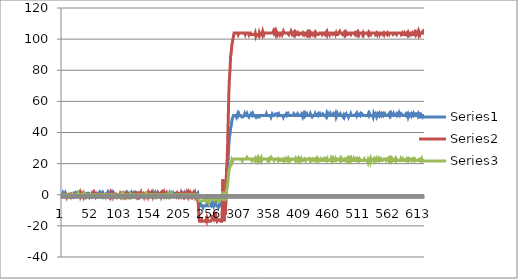
| Category | Series 0 | Series 1 | Series 2 |
|---|---|---|---|
| 0 | 0 | 0 | 0 |
| 1 | 1 | -1 | 0 |
| 2 | 0 | -1 | 0 |
| 3 | 0 | -1 | -1 |
| 4 | 0 | -1 | -1 |
| 5 | 1 | -1 | -1 |
| 6 | 0 | 0 | 0 |
| 7 | 0 | -1 | 0 |
| 8 | 0 | 1 | 0 |
| 9 | 0 | -1 | 0 |
| 10 | 0 | -1 | 0 |
| 11 | 0 | 0 | 0 |
| 12 | 0 | -1 | 0 |
| 13 | 0 | -1 | 0 |
| 14 | 0 | 0 | 0 |
| 15 | 0 | -1 | 0 |
| 16 | 0 | 0 | 0 |
| 17 | 0 | 0 | 0 |
| 18 | 0 | -1 | 0 |
| 19 | 0 | 0 | 0 |
| 20 | 0 | -1 | 0 |
| 21 | 0 | -1 | 0 |
| 22 | 1 | 0 | 0 |
| 23 | 0 | -1 | 0 |
| 24 | 1 | -1 | 0 |
| 25 | 1 | -1 | 0 |
| 26 | 0 | 0 | 0 |
| 27 | 0 | 0 | 1 |
| 28 | 0 | 1 | 0 |
| 29 | 0 | 0 | 0 |
| 30 | 0 | 1 | 0 |
| 31 | 0 | -1 | 0 |
| 32 | 1 | 0 | 0 |
| 33 | 0 | 0 | 0 |
| 34 | 0 | -1 | 0 |
| 35 | 1 | 0 | 0 |
| 36 | 1 | -1 | 0 |
| 37 | 1 | 1 | 1 |
| 38 | 0 | 1 | 0 |
| 39 | 0 | 0 | 0 |
| 40 | 0 | -1 | 0 |
| 41 | 0 | 0 | 0 |
| 42 | 1 | 0 | 0 |
| 43 | 1 | 0 | 0 |
| 44 | 1 | 0 | 0 |
| 45 | 1 | 0 | 0 |
| 46 | 0 | -1 | 0 |
| 47 | 0 | 0 | 0 |
| 48 | 0 | 0 | 0 |
| 49 | 0 | -1 | 0 |
| 50 | 0 | 0 | -1 |
| 51 | 0 | -2 | 0 |
| 52 | 0 | 0 | 0 |
| 53 | 1 | 0 | 0 |
| 54 | 0 | 0 | 0 |
| 55 | 0 | 1 | 0 |
| 56 | 0 | 1 | 0 |
| 57 | 0 | -1 | 0 |
| 58 | 0 | 0 | 0 |
| 59 | 0 | -1 | 0 |
| 60 | 0 | -1 | 0 |
| 61 | 0 | -1 | -1 |
| 62 | 1 | -1 | -1 |
| 63 | 0 | -1 | 0 |
| 64 | 1 | 1 | 0 |
| 65 | 0 | -1 | 0 |
| 66 | 1 | 1 | 0 |
| 67 | 1 | -1 | 0 |
| 68 | 0 | -1 | -1 |
| 69 | 1 | -1 | 0 |
| 70 | 0 | 0 | 0 |
| 71 | 0 | -1 | 0 |
| 72 | 0 | -1 | 0 |
| 73 | 0 | 0 | 0 |
| 74 | 0 | -1 | 0 |
| 75 | 0 | 0 | 0 |
| 76 | 0 | 0 | 0 |
| 77 | 1 | 0 | 0 |
| 78 | 0 | 0 | 0 |
| 79 | 1 | 0 | -1 |
| 80 | 0 | -1 | 0 |
| 81 | 0 | 0 | 0 |
| 82 | 1 | 1 | 0 |
| 83 | 0 | -1 | 0 |
| 84 | 1 | 0 | 0 |
| 85 | 0 | 0 | 0 |
| 86 | 1 | 1 | 0 |
| 87 | 0 | -1 | 0 |
| 88 | 1 | 0 | 0 |
| 89 | 1 | 0 | 0 |
| 90 | 0 | -1 | 0 |
| 91 | 0 | -1 | 0 |
| 92 | 0 | 0 | 0 |
| 93 | 0 | -1 | 0 |
| 94 | 0 | 0 | 0 |
| 95 | 0 | 0 | -1 |
| 96 | 0 | 0 | -1 |
| 97 | 0 | 0 | 0 |
| 98 | 0 | -1 | 0 |
| 99 | 1 | 0 | 0 |
| 100 | 1 | -1 | -1 |
| 101 | 0 | 0 | 0 |
| 102 | 0 | 0 | -1 |
| 103 | 0 | 1 | 0 |
| 104 | 0 | 0 | -1 |
| 105 | 0 | -1 | 0 |
| 106 | 0 | 0 | -1 |
| 107 | 0 | -1 | 0 |
| 108 | 0 | 0 | 0 |
| 109 | 0 | -1 | 0 |
| 110 | 1 | 0 | 0 |
| 111 | 0 | -1 | 0 |
| 112 | 1 | -1 | 0 |
| 113 | 1 | 0 | 0 |
| 114 | 0 | -1 | 0 |
| 115 | 0 | 0 | -1 |
| 116 | 1 | 0 | 0 |
| 117 | 0 | -1 | -1 |
| 118 | 1 | 0 | 0 |
| 119 | 0 | 0 | 0 |
| 120 | 0 | -1 | 0 |
| 121 | 1 | -1 | -1 |
| 122 | 0 | 0 | -1 |
| 123 | 0 | 0 | 0 |
| 124 | 1 | 1 | 0 |
| 125 | 0 | 0 | 0 |
| 126 | 1 | -1 | 0 |
| 127 | 1 | 0 | 0 |
| 128 | 0 | -1 | 0 |
| 129 | 0 | 0 | 0 |
| 130 | 1 | -1 | 0 |
| 131 | 1 | 0 | 0 |
| 132 | 0 | -1 | 0 |
| 133 | 0 | -1 | 0 |
| 134 | 1 | 1 | 0 |
| 135 | 0 | -1 | 0 |
| 136 | 0 | -1 | 0 |
| 137 | 0 | -1 | 0 |
| 138 | 0 | 0 | 0 |
| 139 | 0 | -1 | 0 |
| 140 | 0 | 1 | 0 |
| 141 | 0 | 1 | -1 |
| 142 | 0 | 1 | 0 |
| 143 | 0 | 0 | -1 |
| 144 | 0 | 0 | 0 |
| 145 | 0 | 0 | -1 |
| 146 | 1 | 1 | 0 |
| 147 | 1 | -1 | 0 |
| 148 | 1 | 0 | 0 |
| 149 | 1 | 1 | 0 |
| 150 | 1 | 1 | 0 |
| 151 | 1 | 0 | 0 |
| 152 | 1 | 1 | 0 |
| 153 | 0 | 0 | 0 |
| 154 | 0 | 1 | 0 |
| 155 | 0 | -1 | 0 |
| 156 | 0 | 0 | -1 |
| 157 | 1 | 0 | 0 |
| 158 | 0 | -1 | 0 |
| 159 | 1 | -1 | 0 |
| 160 | 0 | 0 | -1 |
| 161 | 0 | 0 | 0 |
| 162 | 1 | 0 | 0 |
| 163 | 0 | 1 | 0 |
| 164 | 0 | 0 | 0 |
| 165 | 1 | 0 | 0 |
| 166 | 1 | 0 | 0 |
| 167 | 1 | 0 | 0 |
| 168 | 0 | 1 | 0 |
| 169 | 1 | -1 | 0 |
| 170 | 1 | 0 | 0 |
| 171 | 0 | 1 | 0 |
| 172 | 1 | 0 | 0 |
| 173 | 0 | 1 | 0 |
| 174 | 1 | -1 | -1 |
| 175 | 0 | 1 | 0 |
| 176 | 0 | 1 | 0 |
| 177 | 1 | 0 | 0 |
| 178 | 1 | 1 | -1 |
| 179 | 1 | 0 | 0 |
| 180 | 1 | 0 | 0 |
| 181 | 1 | -1 | -1 |
| 182 | 0 | 0 | 0 |
| 183 | 1 | 0 | -1 |
| 184 | 0 | 0 | 0 |
| 185 | 0 | 0 | 0 |
| 186 | 1 | 0 | 0 |
| 187 | 0 | 0 | 1 |
| 188 | 0 | 0 | 0 |
| 189 | 1 | -1 | 0 |
| 190 | 0 | -1 | -1 |
| 191 | 1 | -1 | -1 |
| 192 | 1 | -1 | -1 |
| 193 | 1 | 0 | -1 |
| 194 | 1 | 0 | 0 |
| 195 | 1 | 1 | 0 |
| 196 | 0 | -1 | 0 |
| 197 | 1 | -1 | 0 |
| 198 | 1 | 0 | 0 |
| 199 | 1 | -1 | 0 |
| 200 | 0 | 0 | -1 |
| 201 | 0 | 0 | 0 |
| 202 | 1 | -1 | 0 |
| 203 | 0 | 1 | 0 |
| 204 | 0 | 0 | 0 |
| 205 | 0 | 0 | 0 |
| 206 | 1 | 0 | 0 |
| 207 | 1 | -1 | 0 |
| 208 | 0 | 0 | 0 |
| 209 | 1 | -1 | 0 |
| 210 | 0 | 0 | 0 |
| 211 | 0 | 0 | 0 |
| 212 | 0 | -1 | 0 |
| 213 | 1 | 1 | 0 |
| 214 | 0 | 0 | 0 |
| 215 | 0 | -1 | 0 |
| 216 | 0 | 1 | 0 |
| 217 | 0 | 0 | 0 |
| 218 | 0 | 1 | 0 |
| 219 | 1 | 0 | 0 |
| 220 | 1 | -1 | 0 |
| 221 | 1 | 0 | 0 |
| 222 | 1 | -1 | 0 |
| 223 | 0 | 0 | 0 |
| 224 | 0 | 1 | 0 |
| 225 | 1 | 0 | 0 |
| 226 | 0 | 1 | 0 |
| 227 | 1 | -1 | 0 |
| 228 | 1 | 0 | 0 |
| 229 | 0 | 0 | 0 |
| 230 | 0 | -1 | 0 |
| 231 | 1 | -1 | 0 |
| 232 | -2 | -6 | -2 |
| 233 | -7 | -15 | -3 |
| 234 | -7 | -17 | -4 |
| 235 | -7 | -17 | -4 |
| 236 | -6 | -17 | -4 |
| 237 | -7 | -17 | -4 |
| 238 | -7 | -16 | -4 |
| 239 | -7 | -17 | -4 |
| 240 | -8 | -17 | -4 |
| 241 | -7 | -17 | -4 |
| 242 | -7 | -17 | -3 |
| 243 | -7 | -17 | -3 |
| 244 | -7 | -17 | -3 |
| 245 | -7 | -16 | -4 |
| 246 | -7 | -17 | -3 |
| 247 | -6 | -15 | -2 |
| 248 | -7 | -16 | -3 |
| 249 | -7 | -17 | -3 |
| 250 | -7 | -17 | -5 |
| 251 | -7 | -17 | -3 |
| 252 | -6 | -17 | -3 |
| 253 | -6 | -17 | -3 |
| 254 | -7 | -17 | -3 |
| 255 | -7 | -16 | -3 |
| 256 | -5 | -13 | -3 |
| 257 | -5 | -14 | -3 |
| 258 | -7 | -15 | -2 |
| 259 | -5 | -13 | -3 |
| 260 | -5 | -12 | -2 |
| 261 | -4 | -11 | -2 |
| 262 | -6 | -17 | -3 |
| 263 | -7 | -16 | -3 |
| 264 | -7 | -17 | -3 |
| 265 | -7 | -17 | -3 |
| 266 | -8 | -16 | -4 |
| 267 | -7 | -16 | -3 |
| 268 | -6 | -16 | -4 |
| 269 | -7 | -16 | -4 |
| 270 | -7 | -17 | -3 |
| 271 | -7 | -17 | -2 |
| 272 | -7 | -17 | -3 |
| 273 | -1 | -6 | 0 |
| 274 | 4 | 10 | 2 |
| 275 | -2 | -6 | 0 |
| 276 | -8 | -17 | -4 |
| 277 | -2 | -8 | -1 |
| 278 | -5 | -13 | -3 |
| 279 | 0 | -1 | 0 |
| 280 | 9 | 16 | 3 |
| 281 | 11 | 21 | 4 |
| 282 | 16 | 33 | 7 |
| 283 | 24 | 49 | 11 |
| 284 | 32 | 65 | 15 |
| 285 | 37 | 75 | 17 |
| 286 | 39 | 80 | 18 |
| 287 | 43 | 89 | 19 |
| 288 | 44 | 91 | 20 |
| 289 | 47 | 96 | 22 |
| 290 | 49 | 98 | 21 |
| 291 | 49 | 100 | 22 |
| 292 | 51 | 102 | 23 |
| 293 | 51 | 104 | 23 |
| 294 | 51 | 104 | 23 |
| 295 | 51 | 104 | 23 |
| 296 | 51 | 104 | 23 |
| 297 | 50 | 104 | 23 |
| 298 | 51 | 104 | 23 |
| 299 | 52 | 104 | 23 |
| 300 | 51 | 103 | 23 |
| 301 | 52 | 104 | 23 |
| 302 | 51 | 104 | 23 |
| 303 | 51 | 104 | 23 |
| 304 | 51 | 104 | 23 |
| 305 | 51 | 104 | 23 |
| 306 | 50 | 104 | 23 |
| 307 | 50 | 104 | 22 |
| 308 | 50 | 104 | 23 |
| 309 | 50 | 104 | 23 |
| 310 | 51 | 104 | 23 |
| 311 | 52 | 104 | 23 |
| 312 | 51 | 103 | 23 |
| 313 | 51 | 104 | 23 |
| 314 | 51 | 104 | 23 |
| 315 | 52 | 104 | 24 |
| 316 | 51 | 104 | 24 |
| 317 | 51 | 104 | 23 |
| 318 | 50 | 103 | 23 |
| 319 | 51 | 104 | 23 |
| 320 | 51 | 104 | 23 |
| 321 | 51 | 104 | 23 |
| 322 | 52 | 103 | 23 |
| 323 | 52 | 103 | 22 |
| 324 | 51 | 103 | 23 |
| 325 | 52 | 103 | 23 |
| 326 | 51 | 103 | 23 |
| 327 | 51 | 103 | 23 |
| 328 | 51 | 103 | 22 |
| 329 | 51 | 104 | 23 |
| 330 | 50 | 102 | 22 |
| 331 | 51 | 103 | 23 |
| 332 | 51 | 103 | 23 |
| 333 | 51 | 103 | 24 |
| 334 | 50 | 103 | 22 |
| 335 | 50 | 102 | 23 |
| 336 | 50 | 104 | 22 |
| 337 | 51 | 103 | 23 |
| 338 | 51 | 104 | 23 |
| 339 | 51 | 104 | 24 |
| 340 | 51 | 104 | 22 |
| 341 | 51 | 103 | 23 |
| 342 | 51 | 105 | 23 |
| 343 | 51 | 104 | 23 |
| 344 | 51 | 103 | 23 |
| 345 | 51 | 104 | 23 |
| 346 | 51 | 104 | 23 |
| 347 | 51 | 104 | 23 |
| 348 | 52 | 104 | 23 |
| 349 | 51 | 104 | 23 |
| 350 | 51 | 104 | 22 |
| 351 | 51 | 104 | 22 |
| 352 | 51 | 104 | 23 |
| 353 | 51 | 104 | 22 |
| 354 | 51 | 104 | 23 |
| 355 | 51 | 104 | 23 |
| 356 | 50 | 104 | 24 |
| 357 | 51 | 104 | 23 |
| 358 | 52 | 104 | 23 |
| 359 | 52 | 104 | 23 |
| 360 | 51 | 105 | 23 |
| 361 | 51 | 104 | 22 |
| 362 | 51 | 105 | 23 |
| 363 | 51 | 104 | 23 |
| 364 | 52 | 103 | 23 |
| 365 | 52 | 105 | 23 |
| 366 | 52 | 105 | 23 |
| 367 | 51 | 103 | 23 |
| 368 | 51 | 104 | 22 |
| 369 | 52 | 104 | 23 |
| 370 | 51 | 104 | 23 |
| 371 | 51 | 103 | 22 |
| 372 | 51 | 104 | 22 |
| 373 | 51 | 104 | 22 |
| 374 | 51 | 104 | 23 |
| 375 | 51 | 103 | 23 |
| 376 | 51 | 103 | 23 |
| 377 | 50 | 105 | 22 |
| 378 | 51 | 104 | 22 |
| 379 | 51 | 104 | 23 |
| 380 | 51 | 104 | 22 |
| 381 | 51 | 104 | 22 |
| 382 | 52 | 104 | 23 |
| 383 | 51 | 104 | 23 |
| 384 | 51 | 104 | 22 |
| 385 | 52 | 104 | 23 |
| 386 | 51 | 103 | 22 |
| 387 | 51 | 104 | 23 |
| 388 | 51 | 104 | 23 |
| 389 | 51 | 104 | 22 |
| 390 | 51 | 105 | 22 |
| 391 | 51 | 105 | 23 |
| 392 | 51 | 103 | 23 |
| 393 | 51 | 103 | 23 |
| 394 | 51 | 104 | 23 |
| 395 | 52 | 103 | 23 |
| 396 | 52 | 104 | 23 |
| 397 | 51 | 103 | 22 |
| 398 | 51 | 104 | 23 |
| 399 | 51 | 103 | 22 |
| 400 | 51 | 103 | 22 |
| 401 | 52 | 103 | 23 |
| 402 | 51 | 104 | 22 |
| 403 | 51 | 104 | 23 |
| 404 | 51 | 103 | 22 |
| 405 | 51 | 103 | 23 |
| 406 | 51 | 104 | 23 |
| 407 | 51 | 104 | 22 |
| 408 | 52 | 104 | 23 |
| 409 | 51 | 104 | 22 |
| 410 | 50 | 103 | 22 |
| 411 | 51 | 104 | 22 |
| 412 | 52 | 104 | 22 |
| 413 | 51 | 103 | 23 |
| 414 | 52 | 104 | 23 |
| 415 | 51 | 104 | 22 |
| 416 | 51 | 104 | 23 |
| 417 | 52 | 103 | 23 |
| 418 | 51 | 104 | 23 |
| 419 | 51 | 103 | 23 |
| 420 | 51 | 104 | 23 |
| 421 | 51 | 103 | 23 |
| 422 | 51 | 104 | 22 |
| 423 | 52 | 103 | 23 |
| 424 | 51 | 104 | 23 |
| 425 | 51 | 104 | 22 |
| 426 | 50 | 103 | 22 |
| 427 | 50 | 104 | 23 |
| 428 | 51 | 104 | 23 |
| 429 | 51 | 104 | 22 |
| 430 | 51 | 103 | 22 |
| 431 | 52 | 104 | 23 |
| 432 | 51 | 103 | 23 |
| 433 | 51 | 104 | 22 |
| 434 | 51 | 104 | 23 |
| 435 | 51 | 103 | 22 |
| 436 | 52 | 103 | 23 |
| 437 | 51 | 103 | 23 |
| 438 | 51 | 103 | 22 |
| 439 | 52 | 104 | 22 |
| 440 | 51 | 104 | 23 |
| 441 | 51 | 104 | 22 |
| 442 | 51 | 104 | 22 |
| 443 | 51 | 103 | 22 |
| 444 | 52 | 104 | 22 |
| 445 | 52 | 104 | 23 |
| 446 | 51 | 104 | 22 |
| 447 | 51 | 104 | 22 |
| 448 | 51 | 103 | 22 |
| 449 | 51 | 104 | 23 |
| 450 | 50 | 104 | 23 |
| 451 | 52 | 105 | 22 |
| 452 | 51 | 103 | 23 |
| 453 | 52 | 104 | 22 |
| 454 | 51 | 104 | 22 |
| 455 | 51 | 104 | 22 |
| 456 | 51 | 103 | 22 |
| 457 | 52 | 104 | 22 |
| 458 | 51 | 104 | 23 |
| 459 | 51 | 104 | 22 |
| 460 | 51 | 104 | 23 |
| 461 | 51 | 103 | 22 |
| 462 | 52 | 103 | 23 |
| 463 | 51 | 104 | 22 |
| 464 | 51 | 104 | 22 |
| 465 | 51 | 104 | 22 |
| 466 | 52 | 103 | 23 |
| 467 | 50 | 104 | 22 |
| 468 | 51 | 103 | 22 |
| 469 | 52 | 103 | 23 |
| 470 | 51 | 103 | 23 |
| 471 | 51 | 104 | 23 |
| 472 | 51 | 104 | 23 |
| 473 | 51 | 105 | 22 |
| 474 | 52 | 104 | 23 |
| 475 | 51 | 104 | 22 |
| 476 | 51 | 104 | 23 |
| 477 | 51 | 104 | 22 |
| 478 | 51 | 103 | 22 |
| 479 | 50 | 103 | 22 |
| 480 | 51 | 104 | 22 |
| 481 | 50 | 103 | 23 |
| 482 | 51 | 104 | 23 |
| 483 | 51 | 103 | 22 |
| 484 | 52 | 104 | 22 |
| 485 | 51 | 103 | 23 |
| 486 | 51 | 103 | 22 |
| 487 | 51 | 103 | 23 |
| 488 | 50 | 104 | 22 |
| 489 | 51 | 104 | 23 |
| 490 | 51 | 104 | 22 |
| 491 | 51 | 104 | 23 |
| 492 | 52 | 103 | 22 |
| 493 | 51 | 104 | 23 |
| 494 | 51 | 104 | 22 |
| 495 | 51 | 104 | 22 |
| 496 | 51 | 104 | 22 |
| 497 | 51 | 104 | 23 |
| 498 | 51 | 104 | 22 |
| 499 | 51 | 103 | 22 |
| 500 | 51 | 104 | 22 |
| 501 | 52 | 104 | 23 |
| 502 | 51 | 103 | 23 |
| 503 | 52 | 104 | 22 |
| 504 | 51 | 103 | 23 |
| 505 | 51 | 104 | 23 |
| 506 | 51 | 103 | 22 |
| 507 | 51 | 104 | 23 |
| 508 | 52 | 104 | 23 |
| 509 | 51 | 104 | 22 |
| 510 | 51 | 104 | 22 |
| 511 | 52 | 104 | 22 |
| 512 | 52 | 103 | 22 |
| 513 | 51 | 104 | 22 |
| 514 | 51 | 103 | 22 |
| 515 | 51 | 104 | 23 |
| 516 | 51 | 104 | 22 |
| 517 | 51 | 104 | 22 |
| 518 | 51 | 104 | 22 |
| 519 | 51 | 104 | 22 |
| 520 | 51 | 104 | 22 |
| 521 | 51 | 103 | 21 |
| 522 | 52 | 104 | 23 |
| 523 | 51 | 103 | 23 |
| 524 | 52 | 104 | 22 |
| 525 | 51 | 104 | 21 |
| 526 | 51 | 103 | 23 |
| 527 | 51 | 104 | 22 |
| 528 | 51 | 104 | 22 |
| 529 | 51 | 104 | 22 |
| 530 | 50 | 104 | 22 |
| 531 | 52 | 104 | 23 |
| 532 | 51 | 104 | 22 |
| 533 | 51 | 104 | 23 |
| 534 | 52 | 103 | 23 |
| 535 | 51 | 103 | 22 |
| 536 | 50 | 104 | 23 |
| 537 | 51 | 103 | 22 |
| 538 | 52 | 104 | 22 |
| 539 | 52 | 104 | 22 |
| 540 | 51 | 104 | 23 |
| 541 | 52 | 103 | 22 |
| 542 | 51 | 104 | 22 |
| 543 | 51 | 104 | 23 |
| 544 | 52 | 104 | 22 |
| 545 | 51 | 104 | 22 |
| 546 | 51 | 103 | 22 |
| 547 | 52 | 103 | 22 |
| 548 | 51 | 104 | 23 |
| 549 | 51 | 103 | 23 |
| 550 | 52 | 104 | 23 |
| 551 | 51 | 104 | 23 |
| 552 | 51 | 104 | 22 |
| 553 | 51 | 104 | 22 |
| 554 | 51 | 103 | 23 |
| 555 | 51 | 104 | 23 |
| 556 | 51 | 104 | 22 |
| 557 | 52 | 103 | 23 |
| 558 | 51 | 104 | 22 |
| 559 | 52 | 104 | 23 |
| 560 | 51 | 104 | 22 |
| 561 | 52 | 104 | 23 |
| 562 | 51 | 104 | 22 |
| 563 | 51 | 104 | 23 |
| 564 | 51 | 103 | 23 |
| 565 | 52 | 103 | 22 |
| 566 | 51 | 104 | 22 |
| 567 | 51 | 104 | 22 |
| 568 | 51 | 104 | 23 |
| 569 | 51 | 104 | 22 |
| 570 | 52 | 103 | 23 |
| 571 | 51 | 104 | 23 |
| 572 | 51 | 104 | 22 |
| 573 | 52 | 104 | 22 |
| 574 | 50 | 104 | 22 |
| 575 | 52 | 104 | 22 |
| 576 | 51 | 104 | 22 |
| 577 | 51 | 104 | 23 |
| 578 | 52 | 103 | 22 |
| 579 | 52 | 103 | 22 |
| 580 | 51 | 104 | 22 |
| 581 | 51 | 103 | 23 |
| 582 | 51 | 103 | 23 |
| 583 | 51 | 103 | 22 |
| 584 | 51 | 104 | 22 |
| 585 | 51 | 104 | 22 |
| 586 | 52 | 103 | 22 |
| 587 | 51 | 103 | 23 |
| 588 | 51 | 104 | 22 |
| 589 | 52 | 103 | 22 |
| 590 | 50 | 104 | 23 |
| 591 | 51 | 103 | 22 |
| 592 | 52 | 104 | 22 |
| 593 | 52 | 104 | 23 |
| 594 | 52 | 104 | 23 |
| 595 | 51 | 103 | 23 |
| 596 | 52 | 103 | 22 |
| 597 | 52 | 104 | 22 |
| 598 | 51 | 103 | 23 |
| 599 | 52 | 103 | 23 |
| 600 | 51 | 103 | 22 |
| 601 | 51 | 104 | 23 |
| 602 | 51 | 103 | 23 |
| 603 | 52 | 104 | 22 |
| 604 | 52 | 103 | 22 |
| 605 | 52 | 103 | 22 |
| 606 | 51 | 104 | 22 |
| 607 | 52 | 105 | 22 |
| 608 | 51 | 103 | 22 |
| 609 | 52 | 104 | 23 |
| 610 | 52 | 103 | 23 |
| 611 | 52 | 104 | 23 |
| 612 | 51 | 104 | 22 |
| 613 | 51 | 104 | 23 |
| 614 | 50 | 104 | 22 |
| 615 | 51 | 105 | 22 |
| 616 | 51 | 104 | 22 |
| 617 | 51 | 103 | 22 |
| 618 | 51 | 103 | 22 |